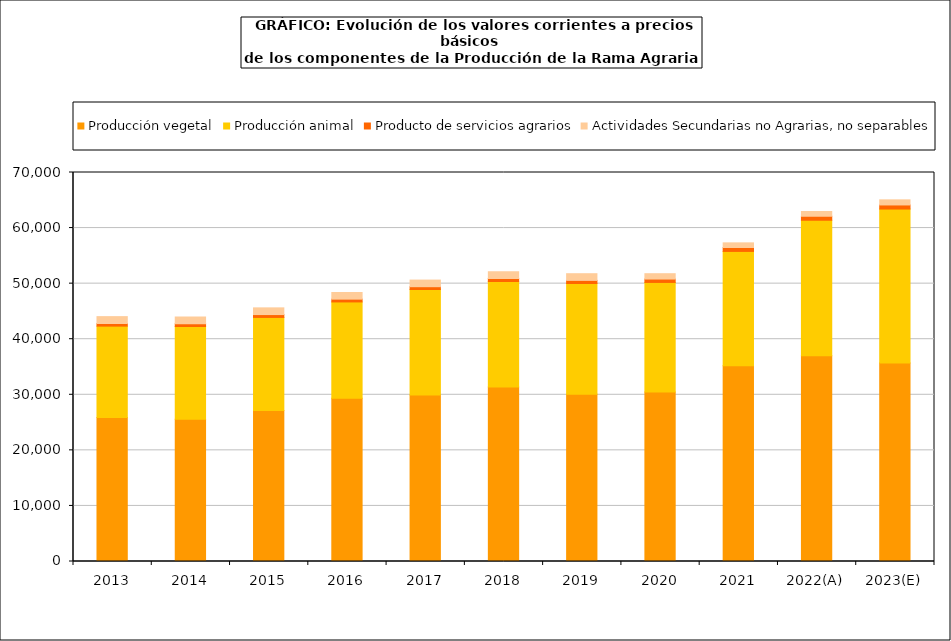
| Category | Producción vegetal | Producción animal | Producto de servicios agrarios | Actividades Secundarias no Agrarias, no separables |
|---|---|---|---|---|
| 2013 | 25895.9 | 16457.7 | 468.7 | 1242.3 |
| 2014 | 25585 | 16681.5 | 520.2 | 1207.1 |
| 2015 | 27192.2 | 16727.3 | 514.9 | 1207.6 |
| 2016 | 29398.1 | 17310.6 | 503.7 | 1199.2 |
| 2017 | 29981.4 | 18962 | 506.1 | 1191.3 |
| 2018 | 31405.7 | 19000.5 | 528.6 | 1209.7 |
| 2019 | 30108.3 | 19919.6 | 558 | 1203.1 |
| 2020 | 30484.7 | 19732.3 | 609.9 | 960.3 |
| 2021 | 35229.2 | 20568.9 | 700.5 | 841.3 |
| 2022(A) | 37009.4 | 24411.3 | 704 | 873 |
| 2023(E) | 35740.5 | 27684.6 | 735.9 | 920 |